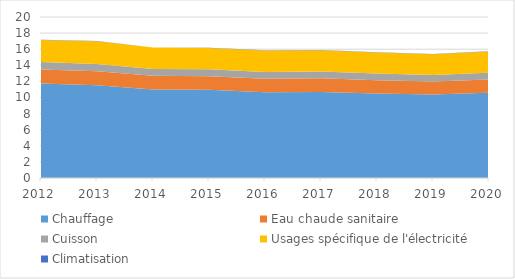
| Category | Chauffage | Eau chaude sanitaire | Cuisson | Usages spécifique de l'électricité | Climatisation |
|---|---|---|---|---|---|
| 2012.0 | 11.737 | 1.744 | 0.927 | 2.747 | 0.017 |
| 2013.0 | 11.513 | 1.759 | 0.902 | 2.819 | 0.018 |
| 2014.0 | 10.994 | 1.697 | 0.864 | 2.649 | 0.019 |
| 2015.0 | 10.957 | 1.681 | 0.859 | 2.66 | 0.021 |
| 2016.0 | 10.647 | 1.696 | 0.834 | 2.672 | 0.028 |
| 2017.0 | 10.698 | 1.696 | 0.841 | 2.649 | 0.028 |
| 2018.0 | 10.493 | 1.664 | 0.826 | 2.617 | 0.032 |
| 2019.0 | 10.36 | 1.63 | 0.812 | 2.566 | 0.04 |
| 2020.0 | 10.594 | 1.661 | 0.836 | 2.616 | 0.053 |